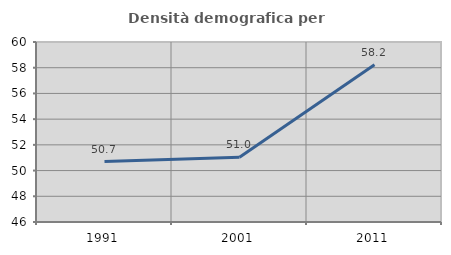
| Category | Densità demografica |
|---|---|
| 1991.0 | 50.698 |
| 2001.0 | 51.044 |
| 2011.0 | 58.237 |